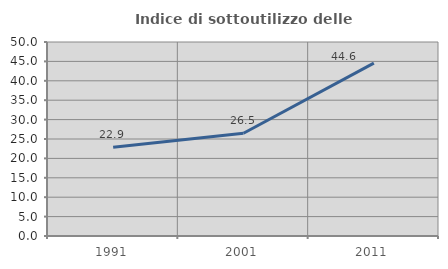
| Category | Indice di sottoutilizzo delle abitazioni  |
|---|---|
| 1991.0 | 22.871 |
| 2001.0 | 26.488 |
| 2011.0 | 44.565 |